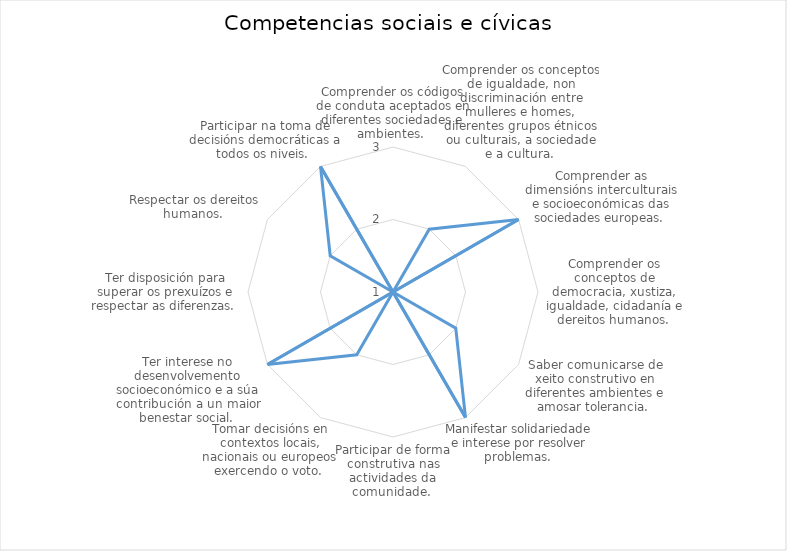
| Category | Series 0 |
|---|---|
| Comprender os códigos de conduta aceptados en diferentes sociedades e ambientes.  | 1 |
| Comprender os conceptos de igualdade, non discriminación entre mulleres e homes, diferentes grupos étnicos ou culturais, a sociedade e a cultura.  | 2 |
| Comprender as dimensións interculturais e socioeconómicas das sociedades europeas.  | 3 |
| Comprender os conceptos de democracia, xustiza, igualdade, cidadanía e dereitos humanos.  | 1 |
| Saber comunicarse de xeito construtivo en diferentes ambientes e amosar tolerancia.  | 2 |
| Manifestar solidariedade e interese por resolver problemas.  | 3 |
| Participar de forma construtiva nas actividades da comunidade.  | 1 |
| Tomar decisións en contextos locais, nacionais ou europeos exercendo o voto.  | 2 |
| Ter interese no desenvolvemento socioeconómico e a súa contribución a un maior benestar social.  | 3 |
| Ter disposición para superar os prexuízos e respectar as diferenzas.  | 1 |
| Respectar os dereitos humanos.  | 2 |
| Participar na toma de decisións democráticas a todos os niveis.  | 3 |